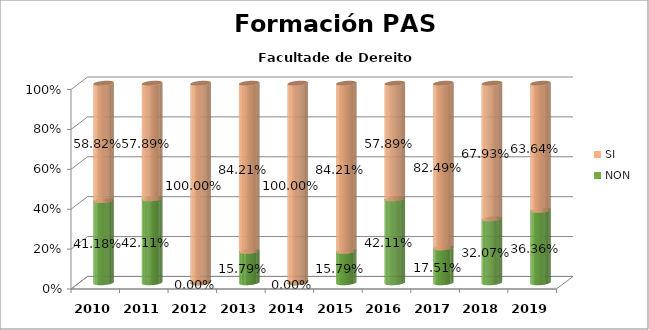
| Category | NON | SI |
|---|---|---|
| 2010.0 | 0.412 | 0.588 |
| 2011.0 | 0.421 | 0.579 |
| 2012.0 | 0 | 1 |
| 2013.0 | 0.158 | 0.842 |
| 2014.0 | 0 | 1 |
| 2015.0 | 0.158 | 0.842 |
| 2016.0 | 0.421 | 0.579 |
| 2017.0 | 0.175 | 0.825 |
| 2018.0 | 0.321 | 0.679 |
| 2019.0 | 0.364 | 0.636 |